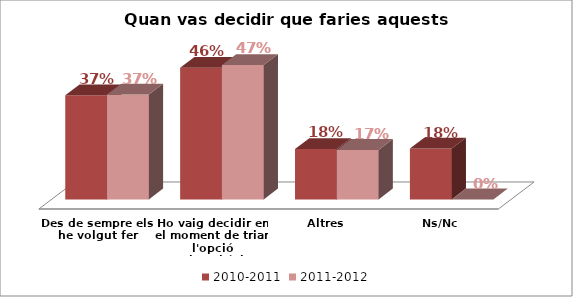
| Category | 2010-2011 | 2011-2012 |
|---|---|---|
| Des de sempre els he volgut fer | 0.367 | 0.369 |
| Ho vaig decidir en el moment de triar l'opció universitària | 0.463 | 0.473 |
| Altres | 0.177 | 0.174 |
| Ns/Nc | 0.179 | 0 |